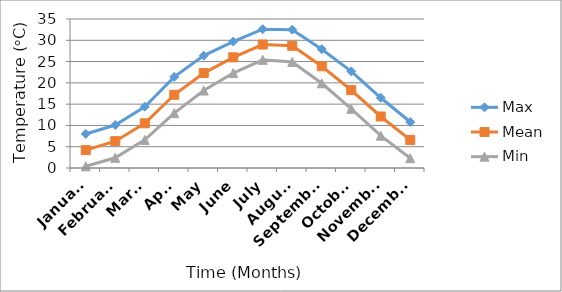
| Category | Max | Mean | Min |
|---|---|---|---|
| January | 8 | 4.2 | 0.4 |
| February | 10.1 | 6.3 | 2.4 |
| March | 14.4 | 10.5 | 6.6 |
| April | 21.4 | 17.2 | 12.9 |
| May | 26.4 | 22.3 | 18.2 |
| June | 29.7 | 26 | 22.3 |
| July | 32.6 | 29 | 25.4 |
| August | 32.5 | 28.7 | 24.9 |
| September | 27.9 | 23.9 | 19.9 |
| October | 22.7 | 18.3 | 13.9 |
| November | 16.5 | 12.1 | 7.6 |
| December | 10.8 | 6.6 | 2.3 |